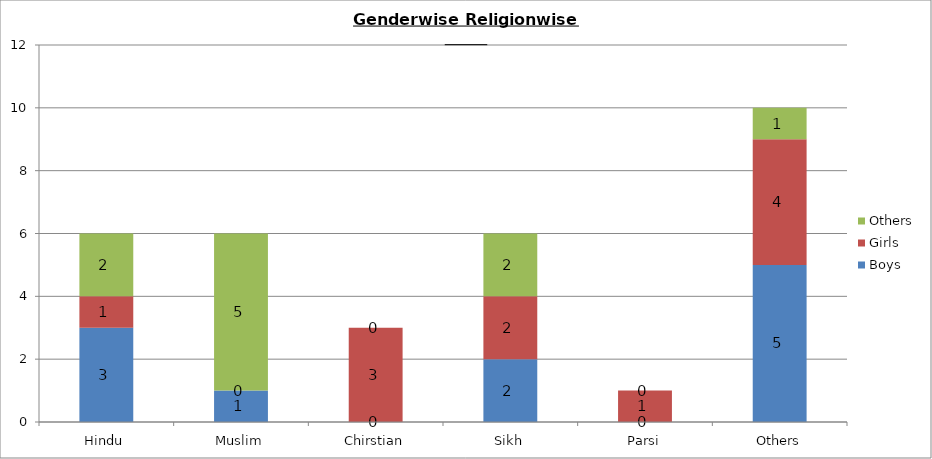
| Category | Boys | Girls | Others |
|---|---|---|---|
| Hindu | 3 | 1 | 2 |
| Muslim | 1 | 0 | 5 |
| Chirstian | 0 | 3 | 0 |
| Sikh | 2 | 2 | 2 |
| Parsi | 0 | 1 | 0 |
| Others | 5 | 4 | 1 |